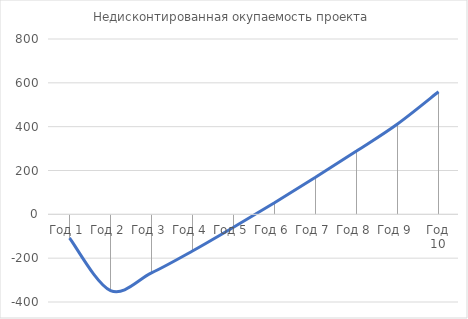
| Category | Недисконтированная окупаемость проекта |
|---|---|
| Год 1 | -108 |
| Год 2 | -347.64 |
| Год 3 | -267.518 |
| Год 4 | -167.449 |
| Год 5 | -59.127 |
| Год 6 | 52.903 |
| Год 7 | 168.753 |
| Год 8 | 288.537 |
| Год 9 | 412.372 |
| Год 10 | 559.123 |